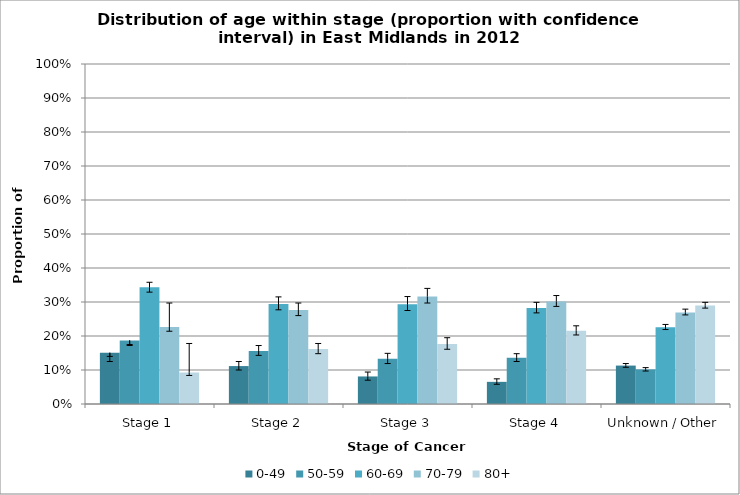
| Category | 0-49 | 50-59 | 60-69 | 70-79 | 80+ |
|---|---|---|---|---|---|
| Stage 1 | 0.151 | 0.187 | 0.343 | 0.227 | 0.093 |
| Stage 2 | 0.112 | 0.156 | 0.294 | 0.277 | 0.162 |
| Stage 3 | 0.081 | 0.133 | 0.293 | 0.316 | 0.176 |
| Stage 4 | 0.065 | 0.136 | 0.282 | 0.302 | 0.215 |
| Unknown / Other | 0.113 | 0.102 | 0.226 | 0.269 | 0.29 |